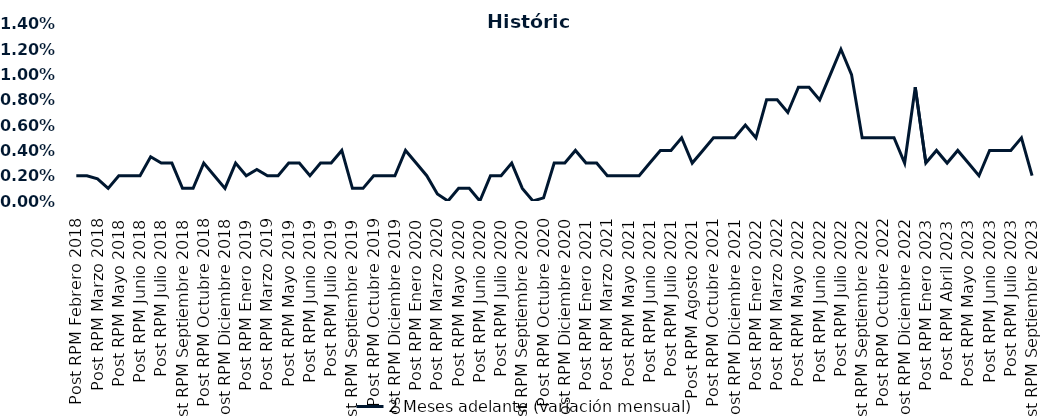
| Category | 2 Meses adelante (variación mensual) |
|---|---|
| Post RPM Febrero 2018 | 0.002 |
| Pre RPM Marzo 2018 | 0.002 |
| Post RPM Marzo 2018 | 0.002 |
| Pre RPM Mayo 2018 | 0.001 |
| Post RPM Mayo 2018 | 0.002 |
| Pre RPM Junio 2018 | 0.002 |
| Post RPM Junio 2018 | 0.002 |
| Pre RPM Julio 2018 | 0.004 |
| Post RPM Julio 2018 | 0.003 |
| Pre RPM Septiembre 2018 | 0.003 |
| Post RPM Septiembre 2018 | 0.001 |
| Pre RPM Octubre 2018 | 0.001 |
| Post RPM Octubre 2018 | 0.003 |
| Pre RPM Diciembre 2018 | 0.002 |
| Post RPM Diciembre 2018 | 0.001 |
| Pre RPM Enero 2019 | 0.003 |
| Post RPM Enero 2019 | 0.002 |
| Pre RPM Marzo 2019 | 0.002 |
| Post RPM Marzo 2019 | 0.002 |
| Pre RPM Mayo 2019 | 0.002 |
| Post RPM Mayo 2019 | 0.003 |
| Pre RPM Junio 2019 | 0.003 |
| Post RPM Junio 2019 | 0.002 |
| Pre RPM Julio 2019 | 0.003 |
| Post RPM Julio 2019 | 0.003 |
| Pre RPM Septiembre 2019 | 0.004 |
| Post RPM Septiembre 2019 | 0.001 |
| Pre RPM Octubre 2019 | 0.001 |
| Post RPM Octubre 2019 | 0.002 |
| Pre RPM Diciembre 2019 | 0.002 |
| Post RPM Diciembre 2019 | 0.002 |
| Pre RPM Enero 2020 | 0.004 |
| Post RPM Enero 2020 | 0.003 |
| Pre RPM Marzo 2020 | 0.002 |
| Post RPM Marzo 2020 | 0.001 |
| Pre RPM Mayo 2020 | 0 |
| Post RPM Mayo 2020 | 0.001 |
| Pre RPM Junio 2020 | 0.001 |
| Post RPM Junio 2020 | 0 |
| Pre RPM Julio 2020 | 0.002 |
| Post RPM Julio 2020 | 0.002 |
| Pre RPM Septiembre 2020 | 0.003 |
| Post RPM Septiembre 2020 | 0.001 |
| Pre RPM Octubre 2020 | 0 |
| Post RPM Octubre 2020 | 0 |
| Pre RPM Diciembre 2020 | 0.003 |
| Post RPM Diciembre 2020 | 0.003 |
| Pre RPM Enero 2021 | 0.004 |
| Post RPM Enero 2021 | 0.003 |
| Pre RPM Marzo 2021 | 0.003 |
| Post RPM Marzo 2021 | 0.002 |
| Pre RPM Mayo 2021 | 0.002 |
| Post RPM Mayo 2021 | 0.002 |
| Pre RPM Junio 2021 | 0.002 |
| Post RPM Junio 2021 | 0.003 |
| Pre RPM Julio 2021 | 0.004 |
| Post RPM Julio 2021 | 0.004 |
| Pre RPM Agosto 2021 | 0.005 |
| Post RPM Agosto 2021 | 0.003 |
| Pre RPM Octubre 2021 | 0.004 |
| Post RPM Octubre 2021 | 0.005 |
| Pre RPM Diciembre 2021 | 0.005 |
| Post RPM Diciembre 2021 | 0.005 |
| Pre RPM Enero 2022 | 0.006 |
| Post RPM Enero 2022 | 0.005 |
| Pre RPM Marzo 2022 | 0.008 |
| Post RPM Marzo 2022 | 0.008 |
| Pre RPM Mayo 2022 | 0.007 |
| Post RPM Mayo 2022 | 0.009 |
| Pre RPM Junio 2022 | 0.009 |
| Post RPM Junio 2022 | 0.008 |
| Pre RPM Julio 2022 | 0.01 |
| Post RPM Julio 2022 | 0.012 |
| Pre RPM Septiembre 2022 | 0.01 |
| Post RPM Septiembre 2022 | 0.005 |
| Pre RPM Octubre 2022 | 0.005 |
| Post RPM Octubre 2022 | 0.005 |
| Pre RPM Diciembre 2022 | 0.005 |
| Post RPM Diciembre 2022 | 0.003 |
| Pre RPM Enero 2023 | 0.009 |
| Post RPM Enero 2023 | 0.003 |
| Pre RPM Abril 2023 | 0.004 |
| Post RPM Abril 2023 | 0.003 |
| Pre RPM Mayo 2023 | 0.004 |
| Post RPM Mayo 2023 | 0.003 |
| Pre RPM Junio 2023 | 0.002 |
| Post RPM Junio 2023 | 0.004 |
| Pre RPM Julio 2023 | 0.004 |
| Post RPM Julio 2023 | 0.004 |
| Pre RPM Septiembre 2023 | 0.005 |
| Post RPM Septiembre 2023 | 0.002 |